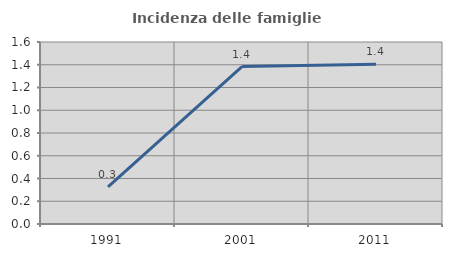
| Category | Incidenza delle famiglie numerose |
|---|---|
| 1991.0 | 0.327 |
| 2001.0 | 1.384 |
| 2011.0 | 1.404 |